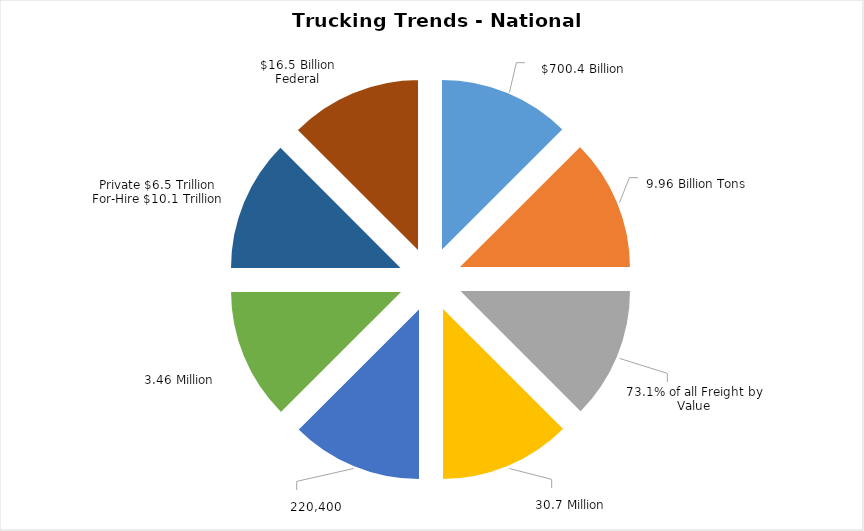
| Category | Series 0 | Series 1 |
|---|---|---|
| 2014 Revenue | 1 | 0 |
| 2014 Tonnage | 1 | 0 |
| 2012 Percentage Truck | 1 | 0 |
| Registered Commercial Trucks | 1 | 0 |
| 2014 Class 8 Truck Sales | 1 | 0 |
| 2014 Class 8 Trucks | 1 | 0 |
| 2012 Shipping Value | 1 | 0 |
| 2013 Taxes Paid By Trucks | 1 | 0 |